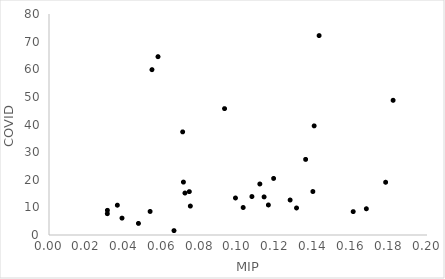
| Category | covid19_viv_mil |
|---|---|
| 0.0928805 | 45.748 |
| 0.0747731 | 10.475 |
| 0.1402994 | 39.499 |
| 0.1309625 | 9.782 |
| 0.1188488 | 20.478 |
| 0.0544821 | 59.842 |
| 0.1160804 | 10.868 |
| 0.1429163 | 72.185 |
| 0.0707234 | 37.33 |
| 0.1679127 | 9.495 |
| 0.1820641 | 48.761 |
| 0.0309061 | 8.927 |
| 0.0711279 | 19.158 |
| 0.0473232 | 4.196 |
| 0.0534982 | 8.522 |
| 0.1396117 | 15.738 |
| 0.0308567 | 7.719 |
| 0.1357822 | 27.37 |
| 0.1275836 | 12.665 |
| 0.1781102 | 19.092 |
| 0.0576702 | 64.544 |
| 0.1027412 | 9.954 |
| 0.0361613 | 10.791 |
| 0.0661298 | 1.589 |
| 0.0986613 | 13.401 |
| 0.1115562 | 18.467 |
| 0.0386273 | 6.113 |
| 0.0719301 | 15.192 |
| 0.1073649 | 13.92 |
| 0.1138038 | 13.789 |
| 0.0742329 | 15.698 |
| 0.1609627 | 8.465 |